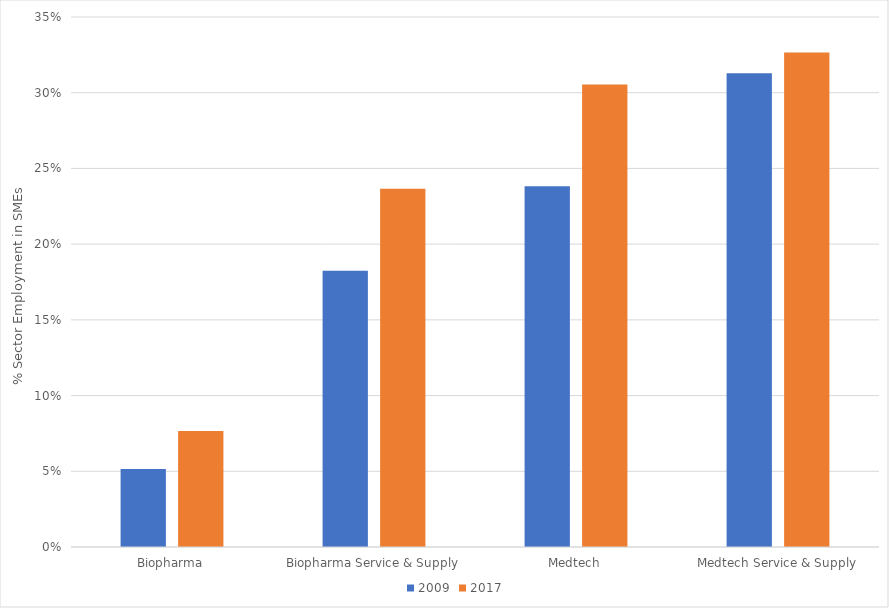
| Category | 2009 | 2017 |
|---|---|---|
| Biopharma | 0.051 | 0.077 |
| Biopharma Service & Supply | 0.182 | 0.237 |
| Medtech | 0.238 | 0.305 |
| Medtech Service & Supply | 0.313 | 0.327 |